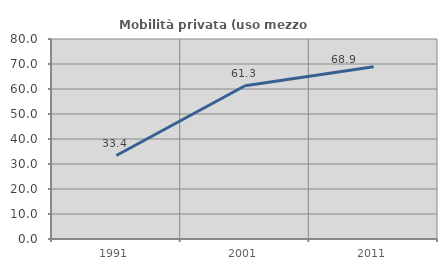
| Category | Mobilità privata (uso mezzo privato) |
|---|---|
| 1991.0 | 33.398 |
| 2001.0 | 61.3 |
| 2011.0 | 68.921 |